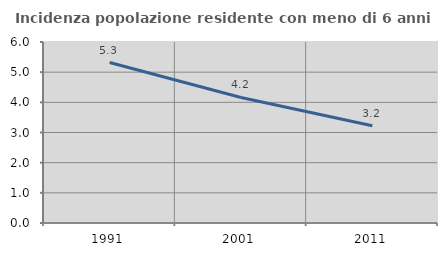
| Category | Incidenza popolazione residente con meno di 6 anni |
|---|---|
| 1991.0 | 5.32 |
| 2001.0 | 4.16 |
| 2011.0 | 3.226 |